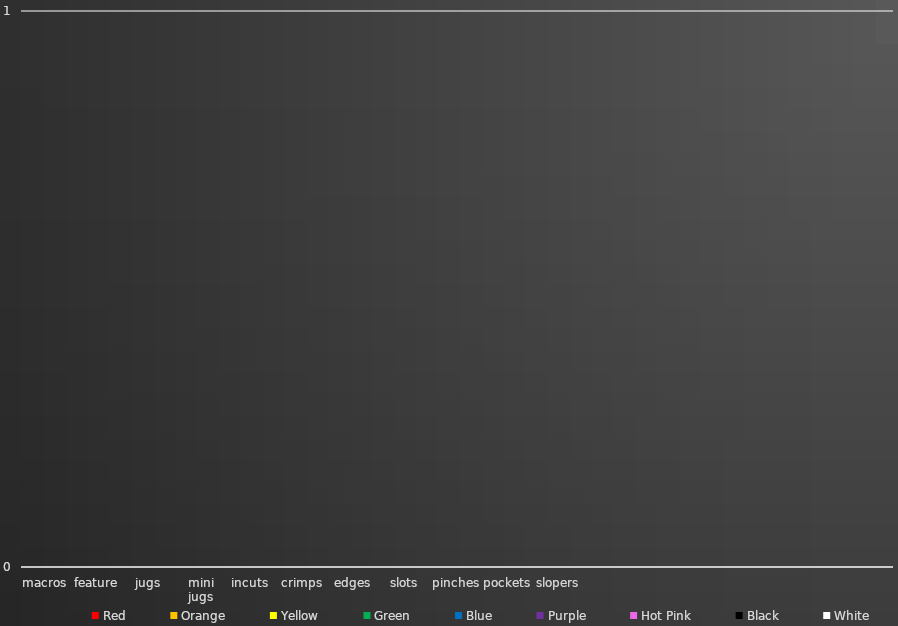
| Category | Red | Orange | Yellow | Green | Blue | Purple | Hot Pink | Black | White |
|---|---|---|---|---|---|---|---|---|---|
| 0 | 0 | 0 | 0 | 0 | 0 | 0 | 0 | 0 | 0 |
| 1 | 0 | 0 | 0 | 0 | 0 | 0 | 0 | 0 | 0 |
| 2 | 0 | 0 | 0 | 0 | 0 | 0 | 0 | 0 | 0 |
| 3 | 0 | 0 | 0 | 0 | 0 | 0 | 0 | 0 | 0 |
| 4 | 0 | 0 | 0 | 0 | 0 | 0 | 0 | 0 | 0 |
| 5 | 0 | 0 | 0 | 0 | 0 | 0 | 0 | 0 | 0 |
| 6 | 0 | 0 | 0 | 0 | 0 | 0 | 0 | 0 | 0 |
| 7 | 0 | 0 | 0 | 0 | 0 | 0 | 0 | 0 | 0 |
| 8 | 0 | 0 | 0 | 0 | 0 | 0 | 0 | 0 | 0 |
| 9 | 0 | 0 | 0 | 0 | 0 | 0 | 0 | 0 | 0 |
| 10 | 0 | 0 | 0 | 0 | 0 | 0 | 0 | 0 | 0 |
| 11 | 0 | 0 | 0 | 0 | 0 | 0 | 0 | 0 | 0 |
| 12 | 0 | 0 | 0 | 0 | 0 | 0 | 0 | 0 | 0 |
| 13 | 0 | 0 | 0 | 0 | 0 | 0 | 0 | 0 | 0 |
| 14 | 0 | 0 | 0 | 0 | 0 | 0 | 0 | 0 | 0 |